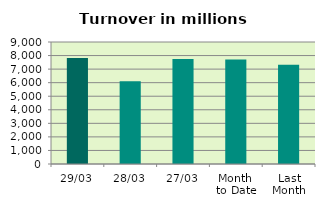
| Category | Series 0 |
|---|---|
| 29/03 | 7816.201 |
| 28/03 | 6112.142 |
| 27/03 | 7750.835 |
| Month 
to Date | 7711.184 |
| Last
Month | 7315.261 |